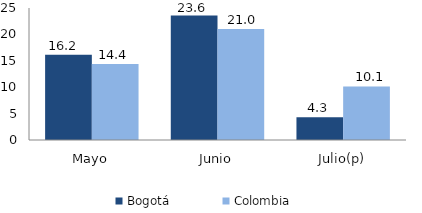
| Category | Bogotá | Colombia |
|---|---|---|
| Mayo | 16.16 | 14.414 |
| Junio | 23.58 | 21.045 |
| Julio(p) | 4.33 | 10.144 |